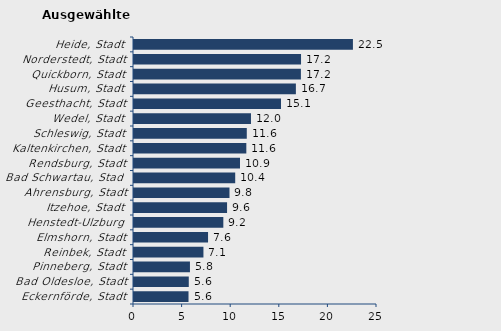
| Category | Wanderungssaldo |
|---|---|
| Eckernförde, Stadt | 5.609 |
| Bad Oldesloe, Stadt | 5.636 |
| Pinneberg, Stadt | 5.756 |
| Reinbek, Stadt | 7.144 |
| Elmshorn, Stadt | 7.619 |
| Henstedt-Ulzburg | 9.19 |
| Itzehoe, Stadt | 9.575 |
| Ahrensburg, Stadt | 9.824 |
| Bad Schwartau, Stadt | 10.413 |
| Rendsburg, Stadt | 10.905 |
| Kaltenkirchen, Stadt | 11.556 |
| Schleswig, Stadt | 11.603 |
| Wedel, Stadt | 12.035 |
| Geesthacht, Stadt | 15.124 |
| Husum, Stadt | 16.654 |
| Quickborn, Stadt | 17.17 |
| Norderstedt, Stadt | 17.185 |
| Heide, Stadt | 22.523 |